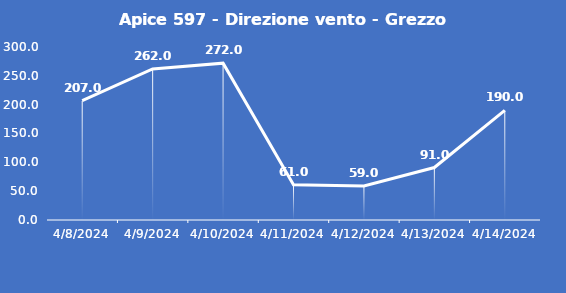
| Category | Apice 597 - Direzione vento - Grezzo (°N) |
|---|---|
| 4/8/24 | 207 |
| 4/9/24 | 262 |
| 4/10/24 | 272 |
| 4/11/24 | 61 |
| 4/12/24 | 59 |
| 4/13/24 | 91 |
| 4/14/24 | 190 |